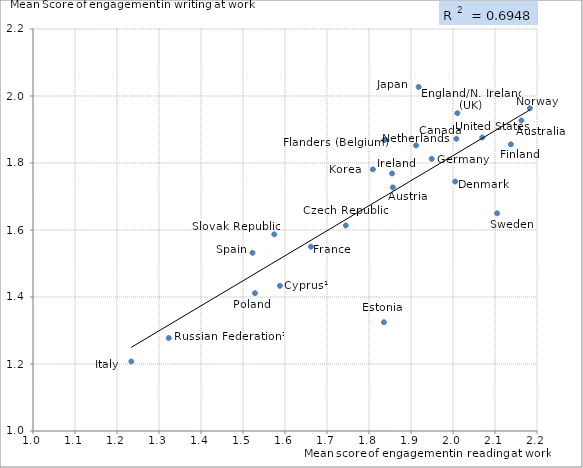
| Category | Series 1 |
|---|---|
| 2.162981491584741 | 1.927 |
| 1.8567223166507096 | 1.727 |
| 2.0079539994263147 | 1.872 |
| 1.5878677527338478 | 1.433 |
| 1.7446370377196088 | 1.614 |
| 2.0052352760753016 | 1.745 |
| 2.0102533912787255 | 1.949 |
| 1.8355057593126958 | 1.325 |
| 2.137753371977311 | 1.856 |
| 1.8367894769030544 | 1.868 |
| 1.6618311278048445 | 1.55 |
| 1.949234467672719 | 1.812 |
| 1.8548075707715308 | 1.769 |
| 1.2340738393928647 | 1.208 |
| 1.9182466323095348 | 2.027 |
| 1.8091253718602471 | 1.781 |
| 1.9120879235587362 | 1.853 |
| 2.18305952592227 | 1.963 |
| 1.5284821920769442 | 1.411 |
| 1.3232898093304097 | 1.278 |
| 1.5744292909056845 | 1.587 |
| 1.522646270850944 | 1.532 |
| 2.1051072306636645 | 1.65 |
| 2.0696827178466206 | 1.876 |